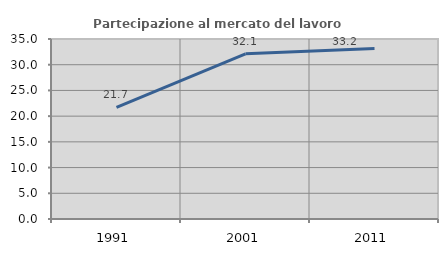
| Category | Partecipazione al mercato del lavoro  femminile |
|---|---|
| 1991.0 | 21.719 |
| 2001.0 | 32.11 |
| 2011.0 | 33.155 |